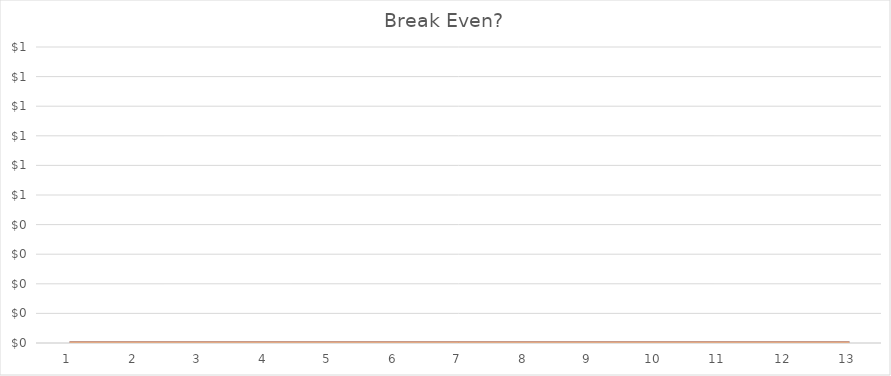
| Category | Series 0 | With Req Ret |
|---|---|---|
| 0 | 0 | 0 |
| 1 | 0 | 0 |
| 2 | 0 | 0 |
| 3 | 0 | 0 |
| 4 | 0 | 0 |
| 5 | 0 | 0 |
| 6 | 0 | 0 |
| 7 | 0 | 0 |
| 8 | 0 | 0 |
| 9 | 0 | 0 |
| 10 | 0 | 0 |
| 11 | 0 | 0 |
| 12 | 0 | 0 |